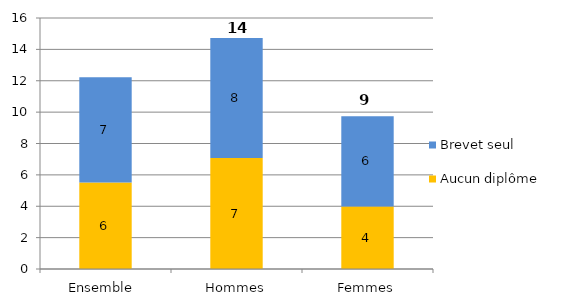
| Category | Aucun diplôme | Brevet seul |
|---|---|---|
| Ensemble  | 5.52 | 6.7 |
| Hommes | 7.07 | 7.65 |
| Femmes | 3.98 | 5.75 |